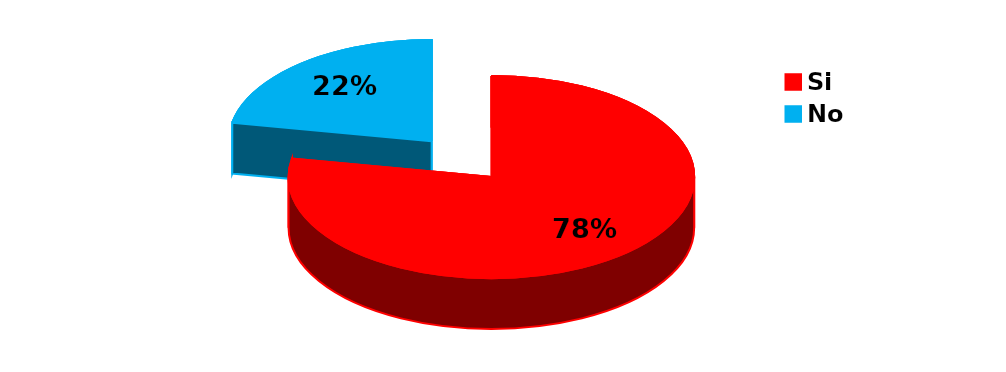
| Category | Series 0 |
|---|---|
| Si | 60 |
| No | 17 |